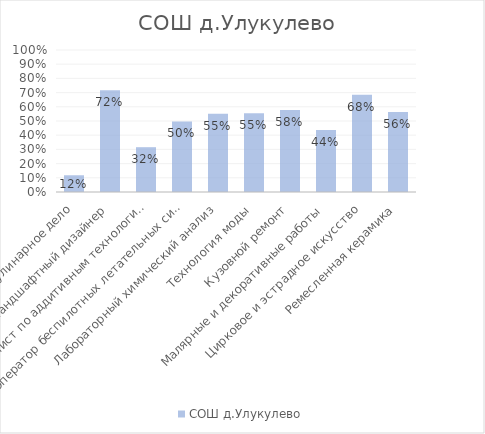
| Category | СОШ д.Улукулево |
|---|---|
| Кулинарное дело | 0.118 |
| Ландшафтный дизайнер | 0.716 |
| Специалист по аддитивным технологиям | 0.316 |
| Оператор беспилотных летательных систем | 0.497 |
| Лабораторный химический анализ | 0.551 |
| Технология моды | 0.555 |
| Кузовной ремонт | 0.578 |
| Малярные и декоративные работы | 0.437 |
| Цирковое и эстрадное искусство | 0.684 |
| Ремесленная керамика | 0.563 |